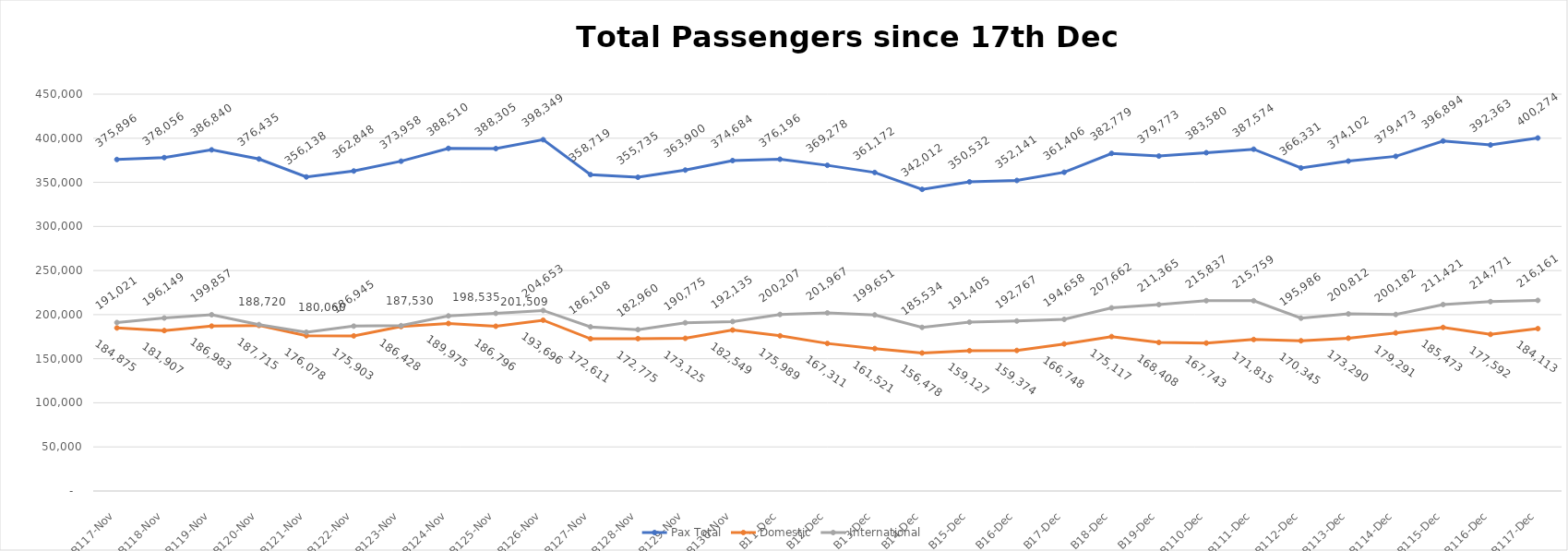
| Category | Pax Total | Domestic | International |
|---|---|---|---|
| 2023-11-17 | 375896 | 184875 | 191021 |
| 2023-11-18 | 378056 | 181907 | 196149 |
| 2023-11-19 | 386840 | 186983 | 199857 |
| 2023-11-20 | 376435 | 187715 | 188720 |
| 2023-11-21 | 356138 | 176078 | 180060 |
| 2023-11-22 | 362848 | 175903 | 186945 |
| 2023-11-23 | 373958 | 186428 | 187530 |
| 2023-11-24 | 388510 | 189975 | 198535 |
| 2023-11-25 | 388305 | 186796 | 201509 |
| 2023-11-26 | 398349 | 193696 | 204653 |
| 2023-11-27 | 358719 | 172611 | 186108 |
| 2023-11-28 | 355735 | 172775 | 182960 |
| 2023-11-29 | 363900 | 173125 | 190775 |
| 2023-11-30 | 374684 | 182549 | 192135 |
| 2023-12-01 | 376196 | 175989 | 200207 |
| 2023-12-02 | 369278 | 167311 | 201967 |
| 2023-12-03 | 361172 | 161521 | 199651 |
| 2023-12-04 | 342012 | 156478 | 185534 |
| 2023-12-05 | 350532 | 159127 | 191405 |
| 2023-12-06 | 352141 | 159374 | 192767 |
| 2023-12-07 | 361406 | 166748 | 194658 |
| 2023-12-08 | 382779 | 175117 | 207662 |
| 2023-12-09 | 379773 | 168408 | 211365 |
| 2023-12-10 | 383580 | 167743 | 215837 |
| 2023-12-11 | 387574 | 171815 | 215759 |
| 2023-12-12 | 366331 | 170345 | 195986 |
| 2023-12-13 | 374102 | 173290 | 200812 |
| 2023-12-14 | 379473 | 179291 | 200182 |
| 2023-12-15 | 396894 | 185473 | 211421 |
| 2023-12-16 | 392363 | 177592 | 214771 |
| 2023-12-17 | 400274 | 184113 | 216161 |